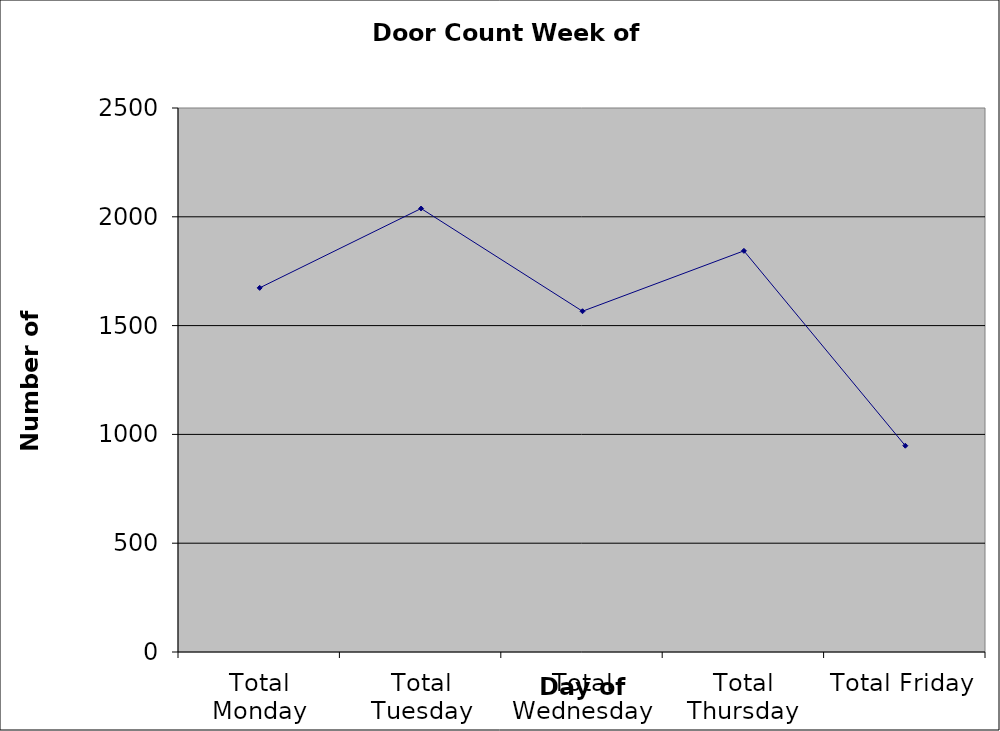
| Category | Series 0 |
|---|---|
| Total Monday | 1673.5 |
| Total Tuesday | 2038 |
| Total Wednesday | 1566 |
| Total Thursday | 1843.5 |
| Total Friday | 948 |